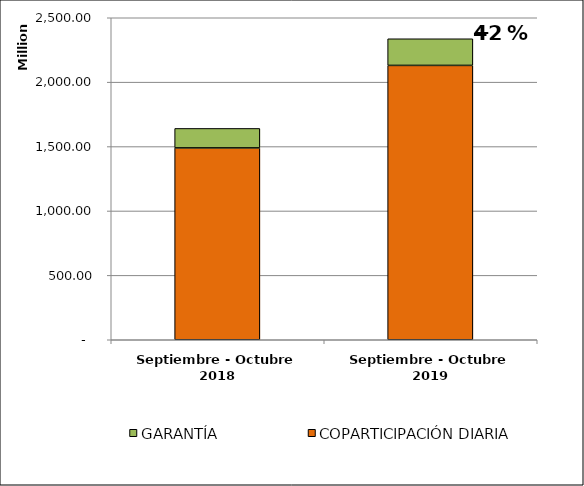
| Category | COPARTICIPACIÓN DIARIA | GARANTÍA |
|---|---|---|
| Septiembre - Octubre 2018 | 1489557921.478 | 151270554.23 |
| Septiembre - Octubre 2019 | 2130092136.523 | 206854210.16 |